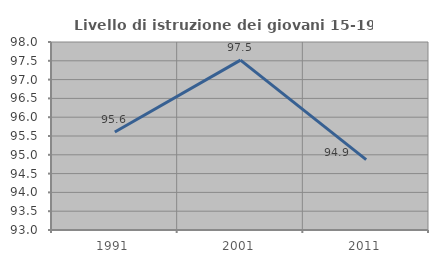
| Category | Livello di istruzione dei giovani 15-19 anni |
|---|---|
| 1991.0 | 95.607 |
| 2001.0 | 97.518 |
| 2011.0 | 94.872 |